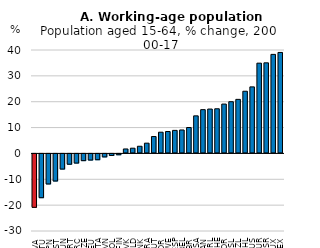
| Category | 2000-2017 |
|---|---|
| LVA | -21.043 |
| LTU | -17.31 |
| JPN | -12.004 |
| EST | -10.866 |
| HUN | -6.24 |
| PRT | -4.37 |
| GRC | -3.922 |
| CZE | -2.983 |
| DEU | -2.755 |
| ITA | -2.631 |
| SVN | -1.539 |
| POL | -0.982 |
| FIN | -0.71 |
| SVK | 1.725 |
| NLD | 2.022 |
| DNK | 2.775 |
| FRA | 3.972 |
| AUT | 6.537 |
| KOR | 8.204 |
| SWE | 8.472 |
| ESP | 8.911 |
| BEL | 9.067 |
| GBR | 10.022 |
| USA | 14.53 |
| CAN | 16.929 |
| IRL | 17.16 |
| CHE | 17.269 |
| NOR | 19.088 |
| ISL | 20 |
| NZL | 20.909 |
| CHL | 24.051 |
| AUS | 25.738 |
| TUR | 34.912 |
| ISR | 35.034 |
| LUX | 38.308 |
| MEX | 39.057 |